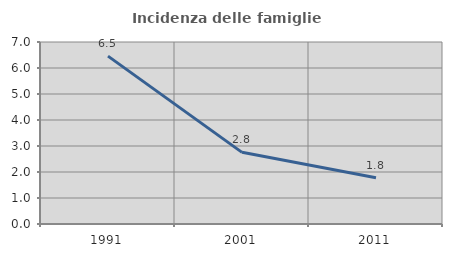
| Category | Incidenza delle famiglie numerose |
|---|---|
| 1991.0 | 6.457 |
| 2001.0 | 2.756 |
| 2011.0 | 1.779 |